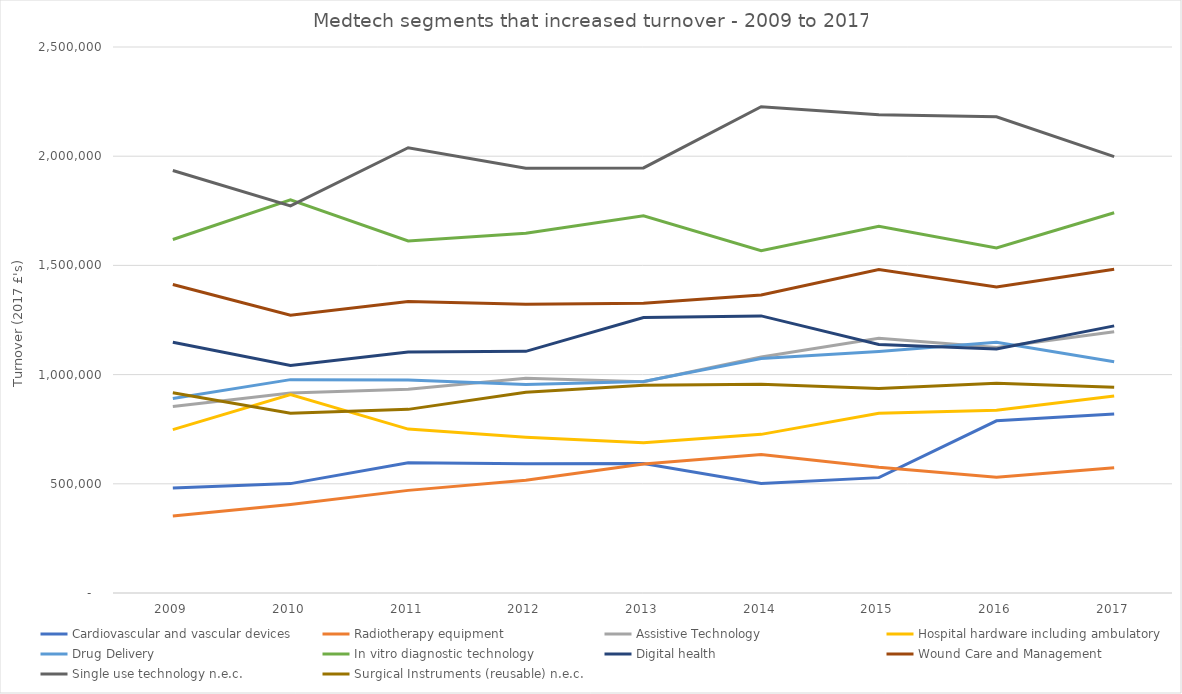
| Category |  Cardiovascular and vascular devices  |  Radiotherapy equipment  |  Assistive Technology  |  Hospital hardware including ambulatory  |  Drug Delivery  |  In vitro diagnostic technology  |  Digital health  |  Wound Care and Management   |  Single use technology n.e.c.  |  Surgical Instruments (reusable) n.e.c.  |
|---|---|---|---|---|---|---|---|---|---|---|
|  2009  | 480766 | 352701 | 854242 | 748137 | 890753 | 1618801 | 1148311 | 1412301 | 1934489 | 916546 |
|  2010  | 500897 | 405694 | 915476 | 908775 | 976945 | 1799967 | 1041444 | 1272003 | 1772307 | 823468 |
|  2011  | 595916 | 469880 | 932382 | 750604 | 975460 | 1611868 | 1103064 | 1334401 | 2038863 | 840815 |
|  2012  | 592197 | 516002 | 983022 | 713610 | 954947 | 1647531 | 1106502 | 1321760 | 1944580 | 918784 |
|  2013  | 592990 | 590262 | 967650 | 687591 | 968128 | 1727370 | 1261082 | 1326396 | 1946237 | 950708 |
|  2014  | 500928 | 634050 | 1080940 | 726374 | 1073778 | 1567230 | 1268765 | 1364529 | 2226719 | 956366 |
|  2015  | 528280 | 575817 | 1165911 | 822488 | 1105772 | 1678874 | 1138240 | 1481312 | 2189609 | 936032 |
|  2016  | 788504 | 529933 | 1124579 | 836651 | 1147994 | 1579985 | 1116970 | 1400874 | 2180805 | 960814 |
|  2017  | 819148 | 573057 | 1195815 | 902501 | 1058930 | 1741066 | 1223149 | 1482608 | 1998166 | 941604 |